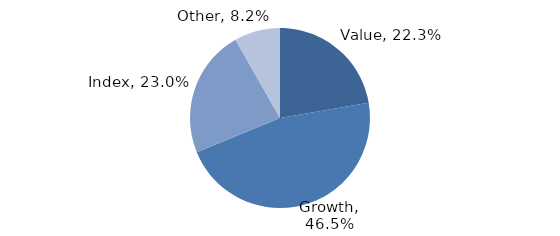
| Category | Investment Style |
|---|---|
| Value | 0.223 |
| Growth | 0.465 |
| Index | 0.23 |
| Other | 0.082 |